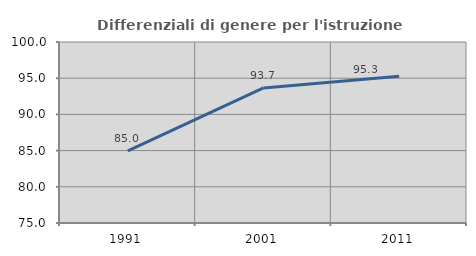
| Category | Differenziali di genere per l'istruzione superiore |
|---|---|
| 1991.0 | 84.964 |
| 2001.0 | 93.654 |
| 2011.0 | 95.253 |